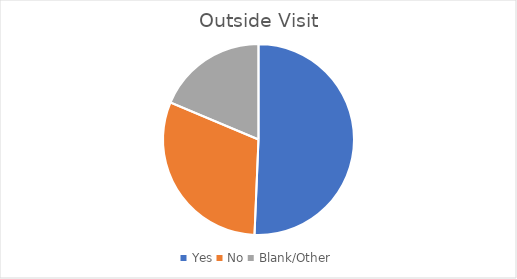
| Category | Series 0 |
|---|---|
| Yes | 38 |
| No | 23 |
| Blank/Other | 14 |